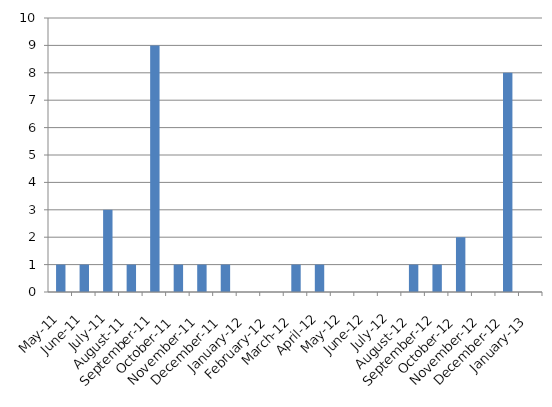
| Category | # |
|---|---|
| 2011-05-02 | 1 |
| 2011-06-02 | 1 |
| 2011-07-02 | 3 |
| 2011-08-02 | 1 |
| 2011-09-02 | 9 |
| 2011-10-02 | 1 |
| 2011-11-02 | 1 |
| 2011-12-02 | 1 |
| 2012-01-01 | 0 |
| 2012-02-03 | 0 |
| 2012-03-02 | 1 |
| 2012-04-02 | 1 |
| 2012-05-02 | 0 |
| 2012-06-02 | 0 |
| 2012-07-02 | 0 |
| 2012-08-02 | 1 |
| 2012-09-02 | 1 |
| 2012-10-02 | 2 |
| 2012-11-02 | 0 |
| 2012-12-02 | 8 |
| 2013-01-02 | 0 |